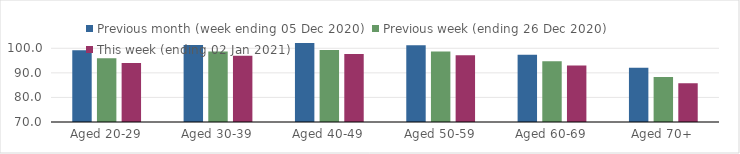
| Category | Previous month (week ending 05 Dec 2020) | Previous week (ending 26 Dec 2020) | This week (ending 02 Jan 2021) |
|---|---|---|---|
| Aged 20-29 | 99.24 | 95.94 | 94.02 |
| Aged 30-39 | 101.36 | 98.67 | 96.93 |
| Aged 40-49 | 102.16 | 99.26 | 97.71 |
| Aged 50-59 | 101.28 | 98.67 | 97.21 |
| Aged 60-69 | 97.39 | 94.73 | 92.97 |
| Aged 70+ | 92.04 | 88.31 | 85.77 |